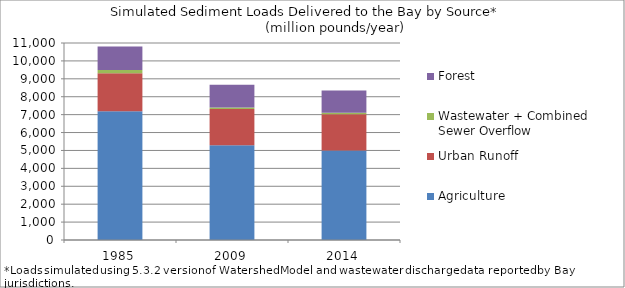
| Category | Agriculture | Urban Runoff | Wastewater + Combined Sewer Overflow | Forest |
|---|---|---|---|---|
| 1985.0 | 7189.988 | 2127.373 | 175.916 | 1305.108 |
| 2009.0 | 5295.442 | 2018.911 | 87.099 | 1273.8 |
| 2014.0 | 4998.464 | 2021.982 | 88.085 | 1239.313 |